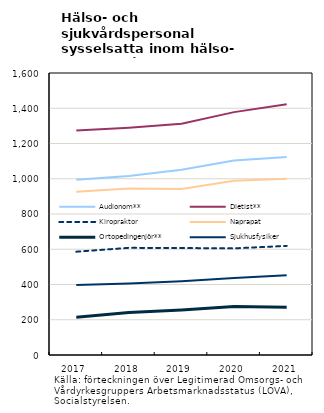
| Category | Audionom** | Dietist** | Kiropraktor | Naprapat | Ortopedingenjör** | Sjukhusfysiker |
|---|---|---|---|---|---|---|
| 2017.0 | 994 | 1274 | 586 | 926 | 214 | 397 |
| 2018.0 | 1015 | 1290 | 608 | 944 | 241 | 406 |
| 2019.0 | 1051 | 1312 | 607 | 942 | 256 | 419 |
| 2020.0 | 1104 | 1378 | 605 | 988 | 275 | 437 |
| 2021.0 | 1123 | 1423 | 619 | 1000 | 271 | 453 |